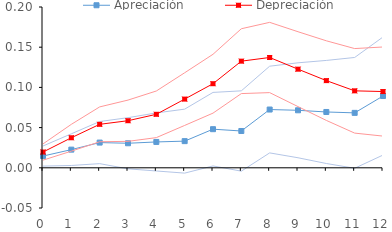
| Category | Apreciación | ci_lb_95_ap | ci_ub_95_ap | Depreciación | ci_lb_95_dep | ci_ub_95_dep |
|---|---|---|---|---|---|---|
| 0.0 | 0.015 | 0.002 | 0.027 | 0.02 | 0.01 | 0.03 |
| 1.0 | 0.023 | 0.003 | 0.042 | 0.037 | 0.021 | 0.054 |
| 2.0 | 0.031 | 0.005 | 0.058 | 0.054 | 0.032 | 0.076 |
| 3.0 | 0.031 | -0.001 | 0.062 | 0.059 | 0.033 | 0.084 |
| 4.0 | 0.032 | -0.004 | 0.068 | 0.067 | 0.038 | 0.096 |
| 5.0 | 0.033 | -0.007 | 0.073 | 0.085 | 0.053 | 0.118 |
| 6.0 | 0.048 | 0.002 | 0.094 | 0.105 | 0.068 | 0.141 |
| 7.0 | 0.046 | -0.004 | 0.096 | 0.133 | 0.092 | 0.173 |
| 8.0 | 0.072 | 0.019 | 0.126 | 0.137 | 0.094 | 0.181 |
| 9.0 | 0.072 | 0.012 | 0.131 | 0.123 | 0.076 | 0.169 |
| 10.0 | 0.069 | 0.005 | 0.134 | 0.108 | 0.059 | 0.158 |
| 11.0 | 0.068 | -0.001 | 0.137 | 0.096 | 0.043 | 0.148 |
| 12.0 | 0.089 | 0.016 | 0.163 | 0.095 | 0.039 | 0.15 |